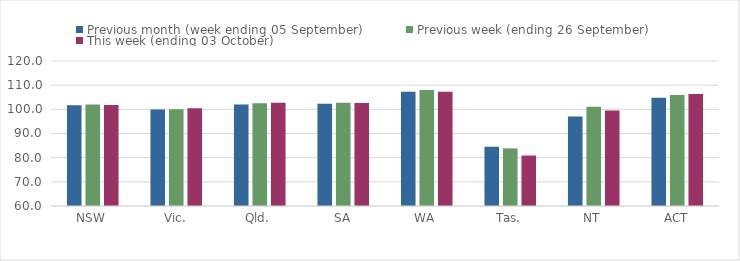
| Category | Previous month (week ending 05 September) | Previous week (ending 26 September) | This week (ending 03 October) |
|---|---|---|---|
| NSW | 101.7 | 102.02 | 101.84 |
| Vic. | 99.9 | 100.07 | 100.45 |
| Qld. | 101.95 | 102.51 | 102.74 |
| SA | 102.34 | 102.7 | 102.63 |
| WA | 107.27 | 107.99 | 107.29 |
| Tas. | 84.52 | 83.84 | 80.88 |
| NT | 97.05 | 101.1 | 99.56 |
| ACT | 104.83 | 105.98 | 106.31 |